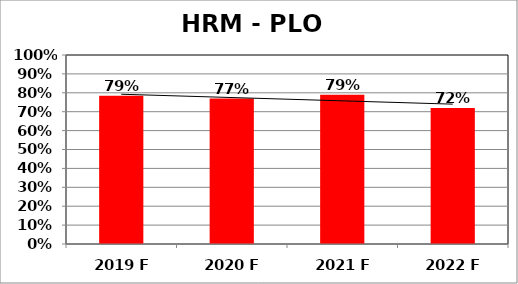
| Category | Series 0 |
|---|---|
| 2019 F | 0.785 |
| 2020 F | 0.77 |
| 2021 F | 0.79 |
| 2022 F | 0.72 |